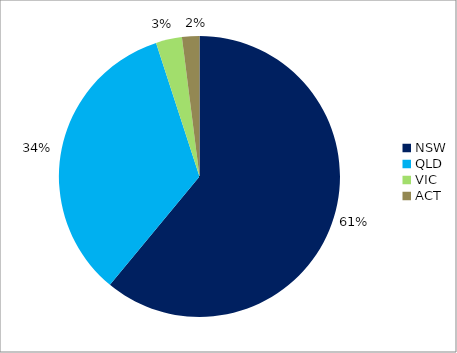
| Category | Series 0 |
|---|---|
| NSW | 0.61 |
| QLD | 0.34 |
| VIC | 0.03 |
| ACT | 0.02 |